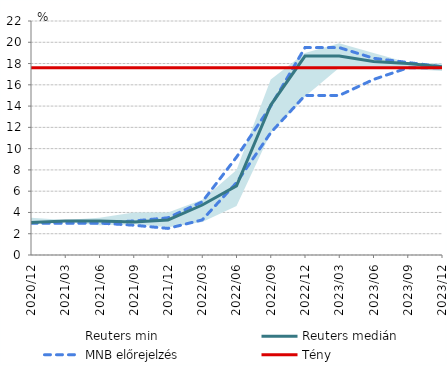
| Category | MNB előrejelzés | Reuters medián |
|---|---|---|
| 2020-12-01 | 3 | 3.05 |
| 2021-03-01 | 3 | 3.2 |
| 2021-06-01 | 3 | 3.2 |
| 2021-09-01 | 3.2 | 3.1 |
| 2021-12-01 | 3.5 | 3.3 |
| 2022-03-01 | 5 | 4.7 |
| 2022-06-01 | 9.2 | 6.5 |
| 2022-09-01 | 14 | 14.1 |
| 2022-12-01 | 19.5 | 18.7 |
| 2023-03-01 | 19.5 | 18.7 |
| 2023-06-01 | 18.5 | 18.2 |
| 2023-09-01 | 18.1 | 18 |
| 2023-12-01 | 17.7 | 17.7 |